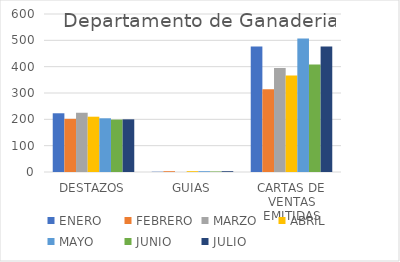
| Category | ENERO | FEBRERO | MARZO | ABRIL | MAYO | JUNIO | JULIO |
|---|---|---|---|---|---|---|---|
| DESTAZOS | 223 | 202 | 225 | 210 | 204 | 199 | 200 |
| GUIAS | 1 | 3 | 0 | 3 | 3 | 2 | 3 |
| CARTAS DE VENTAS EMITIDAS | 477 | 314 | 395 | 366 | 507 | 408 | 477 |